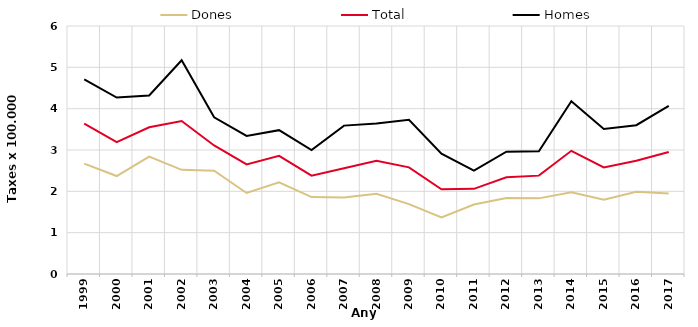
| Category | Dones | Total | Homes |
|---|---|---|---|
| 1999.0 | 2.67 | 3.64 | 4.71 |
| 2000.0 | 2.37 | 3.19 | 4.27 |
| 2001.0 | 2.84 | 3.55 | 4.32 |
| 2002.0 | 2.52 | 3.7 | 5.17 |
| 2003.0 | 2.5 | 3.11 | 3.79 |
| 2004.0 | 1.96 | 2.65 | 3.34 |
| 2005.0 | 2.22 | 2.86 | 3.48 |
| 2006.0 | 1.86 | 2.38 | 3 |
| 2007.0 | 1.85 | 2.56 | 3.59 |
| 2008.0 | 1.94 | 2.74 | 3.64 |
| 2009.0 | 1.69 | 2.58 | 3.73 |
| 2010.0 | 1.37 | 2.05 | 2.91 |
| 2011.0 | 1.68 | 2.06 | 2.5 |
| 2012.0 | 1.84 | 2.34 | 2.96 |
| 2013.0 | 1.83 | 2.38 | 2.97 |
| 2014.0 | 1.98 | 2.98 | 4.18 |
| 2015.0 | 1.8 | 2.58 | 3.51 |
| 2016.0 | 1.99 | 2.74 | 3.6 |
| 2017.0 | 1.95 | 2.95 | 4.07 |